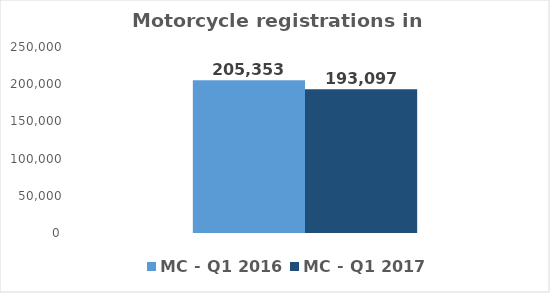
| Category | MC - Q1 2016 | MC - Q1 2017 |
|---|---|---|
| TOTAL | 205353 | 193097 |